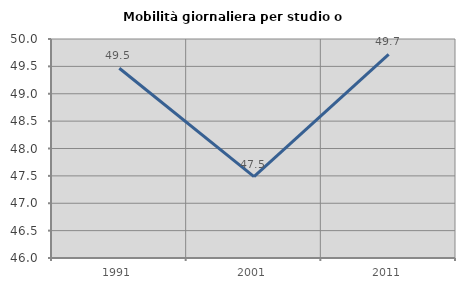
| Category | Mobilità giornaliera per studio o lavoro |
|---|---|
| 1991.0 | 49.466 |
| 2001.0 | 47.487 |
| 2011.0 | 49.72 |